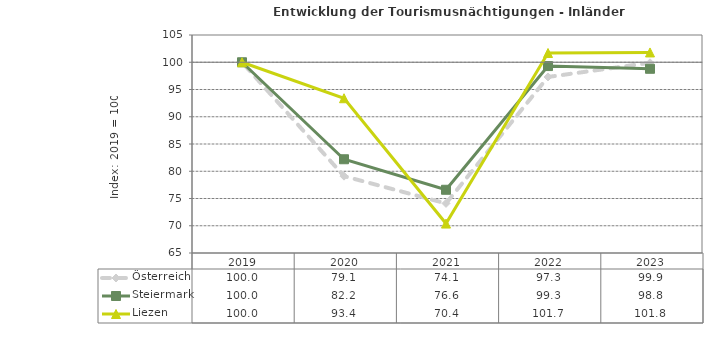
| Category | Österreich | Steiermark | Liezen |
|---|---|---|---|
| 2023.0 | 99.9 | 98.8 | 101.8 |
| 2022.0 | 97.3 | 99.3 | 101.7 |
| 2021.0 | 74.1 | 76.6 | 70.4 |
| 2020.0 | 79.1 | 82.2 | 93.4 |
| 2019.0 | 100 | 100 | 100 |